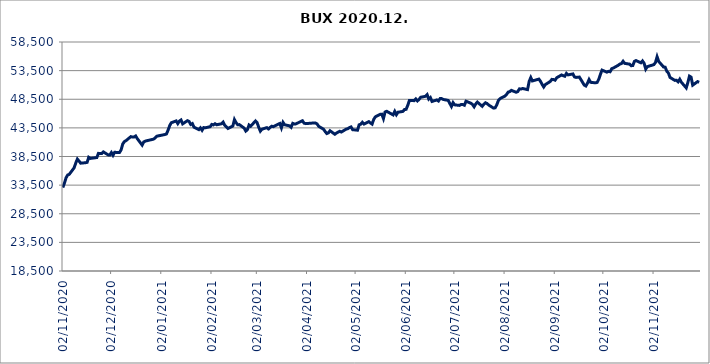
| Category | BUX |
|---|---|
| 02/11/2020 | 33077.55 |
| 03/11/2020 | 33834.43 |
| 04/11/2020 | 34774.72 |
| 05/11/2020 | 35264.98 |
| 06/11/2020 | 35390.44 |
| 09/11/2020 | 36524.01 |
| 10/11/2020 | 37366.63 |
| 11/11/2020 | 38045.8 |
| 12/11/2020 | 37712.82 |
| 13/11/2020 | 37335.1 |
| 16/11/2020 | 37414.6 |
| 17/11/2020 | 37470.5 |
| 18/11/2020 | 38361.82 |
| 19/11/2020 | 38163.61 |
| 20/11/2020 | 38204.67 |
| 23/11/2020 | 38319.06 |
| 24/11/2020 | 39046.5 |
| 25/11/2020 | 39035.1 |
| 26/11/2020 | 39023.56 |
| 27/11/2020 | 39308.9 |
| 30/11/2020 | 38782.16 |
| 01/12/2020 | 38751.98 |
| 02/12/2020 | 39191.11 |
| 03/12/2020 | 38705.12 |
| 04/12/2020 | 39227.87 |
| 07/12/2020 | 39198.31 |
| 08/12/2020 | 39655.97 |
| 09/12/2020 | 40675.89 |
| 10/12/2020 | 41103.01 |
| 11/12/2020 | 41263.67 |
| 14/12/2020 | 41967.89 |
| 15/12/2020 | 41894.09 |
| 16/12/2020 | 41911.27 |
| 17/12/2020 | 42088.03 |
| 18/12/2020 | 41614.92 |
| 21/12/2020 | 40483.17 |
| 22/12/2020 | 41049.52 |
| 23/12/2020 | 41197.14 |
| 28/12/2020 | 41528.44 |
| 29/12/2020 | 41733.11 |
| 30/12/2020 | 42047.586 |
| 04/01/2021 | 42333.48 |
| 05/01/2021 | 42434.3 |
| 06/01/2021 | 43085.06 |
| 07/01/2021 | 43900.7 |
| 08/01/2021 | 44393.21 |
| 11/01/2021 | 44715.79 |
| 12/01/2021 | 44246.56 |
| 13/01/2021 | 44684.36 |
| 14/01/2021 | 44876.42 |
| 15/01/2021 | 44204.45 |
| 18/01/2021 | 44755.59 |
| 19/01/2021 | 44610 |
| 20/01/2021 | 44103.4 |
| 21/01/2021 | 44250.43 |
| 22/01/2021 | 43630.22 |
| 25/01/2021 | 43188.94 |
| 26/01/2021 | 43507.13 |
| 27/01/2021 | 43077.24 |
| 28/01/2021 | 43552.04 |
| 29/01/2021 | 43517.12 |
| 01/02/2021 | 43703.87 |
| 02/02/2021 | 44101.05 |
| 03/02/2021 | 44016.29 |
| 04/02/2021 | 44226.34 |
| 05/02/2021 | 44045.26 |
| 08/02/2021 | 44215.97 |
| 09/02/2021 | 44511.16 |
| 10/02/2021 | 43950.78 |
| 11/02/2021 | 43676.69 |
| 12/02/2021 | 43389.33 |
| 15/02/2021 | 43823.57 |
| 16/02/2021 | 44941.65 |
| 17/02/2021 | 44416.15 |
| 18/02/2021 | 44046.56 |
| 19/02/2021 | 44069.31 |
| 22/02/2021 | 43457.15 |
| 23/02/2021 | 42945.11 |
| 24/02/2021 | 43183.45 |
| 25/02/2021 | 43999.47 |
| 26/02/2021 | 43790.17 |
| 01/03/2021 | 44710.25 |
| 02/03/2021 | 44402.33 |
| 03/03/2021 | 43595.22 |
| 04/03/2021 | 42932.61 |
| 05/03/2021 | 43269 |
| 08/03/2021 | 43540.36 |
| 09/03/2021 | 43312.66 |
| 10/03/2021 | 43579.39 |
| 11/03/2021 | 43784.89 |
| 12/03/2021 | 43711.84 |
| 16/03/2021 | 44268.77 |
| 17/03/2021 | 43504.47 |
| 18/03/2021 | 44465.75 |
| 19/03/2021 | 44042.12 |
| 22/03/2021 | 43851.96 |
| 23/03/2021 | 43603.02 |
| 24/03/2021 | 44290.24 |
| 25/03/2021 | 44168.81 |
| 26/03/2021 | 44201.25 |
| 29/03/2021 | 44617.73 |
| 30/03/2021 | 44746.76 |
| 31/03/2021 | 44326.18 |
| 01/04/2021 | 44242.93 |
| 06/04/2021 | 44357.86 |
| 07/04/2021 | 44357.64 |
| 08/04/2021 | 44194.16 |
| 09/04/2021 | 43775.41 |
| 12/04/2021 | 43267.25 |
| 13/04/2021 | 42865.63 |
| 14/04/2021 | 42514.94 |
| 15/04/2021 | 42626.71 |
| 16/04/2021 | 42997.61 |
| 19/04/2021 | 42388.09 |
| 20/04/2021 | 42597.26 |
| 21/04/2021 | 42753.6 |
| 22/04/2021 | 42906.48 |
| 23/04/2021 | 42772.95 |
| 26/04/2021 | 43281.61 |
| 27/04/2021 | 43357.19 |
| 28/04/2021 | 43549.43 |
| 29/04/2021 | 43665.42 |
| 30/04/2021 | 43183.2 |
| 03/05/2021 | 43093.89 |
| 04/05/2021 | 44036.18 |
| 05/05/2021 | 44142.7 |
| 06/05/2021 | 44472.71 |
| 07/05/2021 | 44164.37 |
| 10/05/2021 | 44587.59 |
| 11/05/2021 | 44350.67 |
| 12/05/2021 | 44160.71 |
| 13/05/2021 | 44974.08 |
| 14/05/2021 | 45429.12 |
| 17/05/2021 | 45862.01 |
| 18/05/2021 | 45891.45 |
| 19/05/2021 | 45128.56 |
| 20/05/2021 | 46261.37 |
| 21/05/2021 | 46396.87 |
| 25/05/2021 | 45765.15 |
| 26/05/2021 | 46379.32 |
| 27/05/2021 | 45802.61 |
| 28/05/2021 | 46233.29 |
| 31/05/2021 | 46371.02 |
| 01/06/2021 | 46699.74 |
| 02/06/2021 | 46736.89 |
| 03/06/2021 | 47422.77 |
| 04/06/2021 | 48282.14 |
| 07/06/2021 | 48255.9 |
| 08/06/2021 | 48546.45 |
| 09/06/2021 | 48206.56 |
| 10/06/2021 | 48475.07 |
| 11/06/2021 | 48845.84 |
| 14/06/2021 | 49015.24 |
| 15/06/2021 | 49299.48 |
| 16/06/2021 | 48525.74 |
| 17/06/2021 | 48795.68 |
| 18/06/2021 | 48117.72 |
| 21/06/2021 | 48379.62 |
| 22/06/2021 | 48193.16 |
| 23/06/2021 | 48624.32 |
| 24/06/2021 | 48610.4 |
| 25/06/2021 | 48461.47 |
| 28/06/2021 | 48301.62 |
| 29/06/2021 | 47759.62 |
| 30/06/2021 | 47238.09 |
| 01/07/2021 | 47908.81 |
| 02/07/2021 | 47520.42 |
| 05/07/2021 | 47423.61 |
| 06/07/2021 | 47592.47 |
| 07/07/2021 | 47574.37 |
| 08/07/2021 | 47452.73 |
| 09/07/2021 | 48157.57 |
| 12/07/2021 | 47804.26 |
| 13/07/2021 | 47592.34 |
| 14/07/2021 | 47184.6 |
| 15/07/2021 | 47677.82 |
| 16/07/2021 | 48003.25 |
| 19/07/2021 | 47268.49 |
| 20/07/2021 | 47622.68 |
| 21/07/2021 | 47882.56 |
| 22/07/2021 | 47756.88 |
| 23/07/2021 | 47491.69 |
| 26/07/2021 | 46952.76 |
| 27/07/2021 | 47002.77 |
| 28/07/2021 | 47527.53 |
| 29/07/2021 | 48286.06 |
| 30/07/2021 | 48610.95 |
| 02/08/2021 | 49041.18 |
| 03/08/2021 | 49315.61 |
| 04/08/2021 | 49745.57 |
| 05/08/2021 | 49830.28 |
| 06/08/2021 | 50050.88 |
| 09/08/2021 | 49721.84 |
| 10/08/2021 | 49849.71 |
| 11/08/2021 | 50317.1 |
| 12/08/2021 | 50289.64 |
| 13/08/2021 | 50378.65 |
| 16/08/2021 | 50183.56 |
| 17/08/2021 | 51626.62 |
| 18/08/2021 | 52288.87 |
| 19/08/2021 | 51696.55 |
| 23/08/2021 | 52023.19 |
| 24/08/2021 | 51633.85 |
| 25/08/2021 | 51093.8 |
| 26/08/2021 | 50640.51 |
| 27/08/2021 | 51068.8 |
| 30/08/2021 | 51602.58 |
| 31/08/2021 | 51969.67 |
| 01/09/2021 | 51946.96 |
| 02/09/2021 | 51830.24 |
| 03/09/2021 | 52255.11 |
| 06/09/2021 | 52743.09 |
| 07/09/2021 | 52623.96 |
| 08/09/2021 | 52514.94 |
| 09/09/2021 | 53015.67 |
| 10/09/2021 | 52755.68 |
| 13/09/2021 | 52922.72 |
| 14/09/2021 | 52392.39 |
| 15/09/2021 | 52317.91 |
| 16/09/2021 | 52331.31 |
| 17/09/2021 | 52376.91 |
| 20/09/2021 | 50982.15 |
| 21/09/2021 | 50815.56 |
| 22/09/2021 | 51298.14 |
| 23/09/2021 | 51946.86 |
| 24/09/2021 | 51453.71 |
| 27/09/2021 | 51365.99 |
| 28/09/2021 | 51446.2 |
| 29/09/2021 | 52004.6 |
| 30/09/2021 | 52854.65 |
| 01/10/2021 | 53589.8 |
| 04/10/2021 | 53234.94 |
| 05/10/2021 | 53369.78 |
| 06/10/2021 | 53305.16 |
| 07/10/2021 | 53844.59 |
| 08/10/2021 | 53955.85 |
| 11/10/2021 | 54432.56 |
| 12/10/2021 | 54648.43 |
| 13/10/2021 | 54733.73 |
| 14/10/2021 | 55136 |
| 15/10/2021 | 54764.34 |
| 18/10/2021 | 54637.92 |
| 19/10/2021 | 54356.89 |
| 20/10/2021 | 54393.63 |
| 21/10/2021 | 55121.35 |
| 22/10/2021 | 55254.39 |
| 25/10/2021 | 54867.62 |
| 26/10/2021 | 55191.91 |
| 27/10/2021 | 54780.65 |
| 28/10/2021 | 53766.44 |
| 29/10/2021 | 54197.71 |
| 02/11/2021 | 54548.9 |
| 03/11/2021 | 54914.54 |
| 04/11/2021 | 55925.58 |
| 05/11/2021 | 55099.88 |
| 08/11/2021 | 54132.14 |
| 09/11/2021 | 54099.27 |
| 10/11/2021 | 53389.23 |
| 11/11/2021 | 53073.34 |
| 12/11/2021 | 52306.67 |
| 15/11/2021 | 51789.8 |
| 16/11/2021 | 51818.41 |
| 17/11/2021 | 51549.36 |
| 18/11/2021 | 51992.3 |
| 19/11/2021 | 51472.91 |
| 22/11/2021 | 50483.99 |
| 23/11/2021 | 51424.26 |
| 24/11/2021 | 52535.97 |
| 25/11/2021 | 52364.37 |
| 26/11/2021 | 50961.25 |
| 29/11/2021 | 51579.66 |
| 30/11/2021 | 51464.6 |